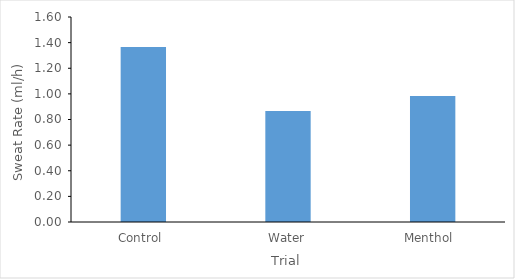
| Category | Series 0 |
|---|---|
| Control  | 1.367 |
| Water | 0.867 |
| Menthol  | 0.983 |